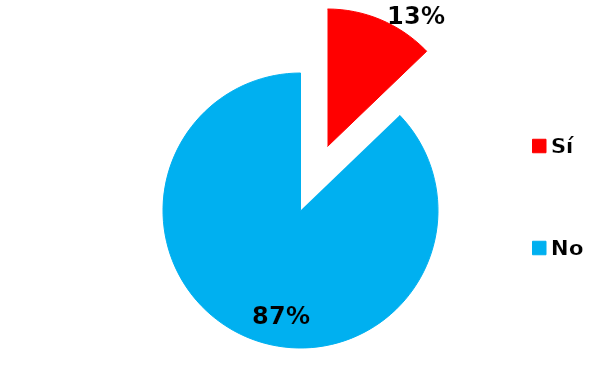
| Category | Series 0 |
|---|---|
| Sí | 5 |
| No | 34 |